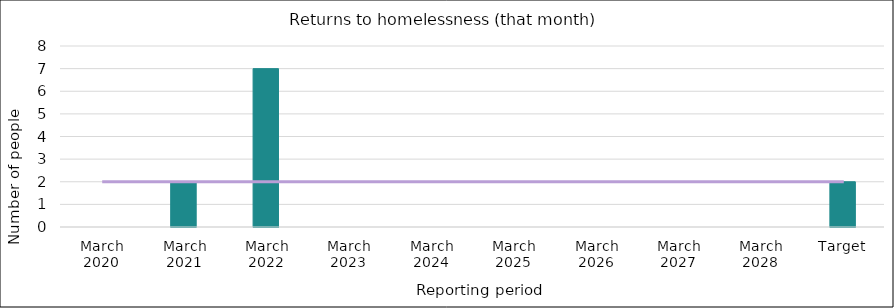
| Category | Series 0 |
|---|---|
| March 2020 | 0 |
| March 2021 | 2 |
| March 2022 | 7 |
| March 2023 | 0 |
| March 2024 | 0 |
| March 2025 | 0 |
| March 2026 | 0 |
| March 2027 | 0 |
| March 2028 | 0 |
| Target | 2 |